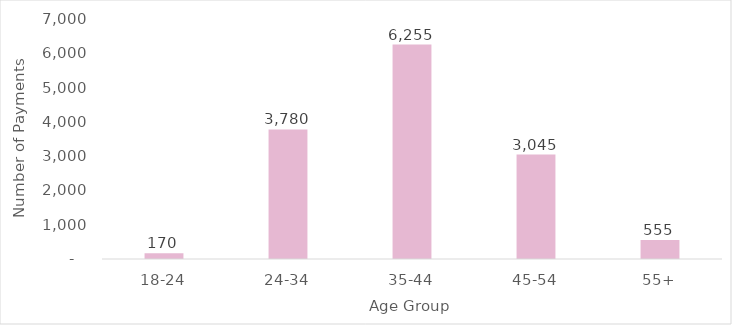
| Category | Number of payments |
|---|---|
| 18-24 | 170 |
| 24-34 | 3780 |
| 35-44 | 6255 |
| 45-54 | 3045 |
| 55+ | 555 |